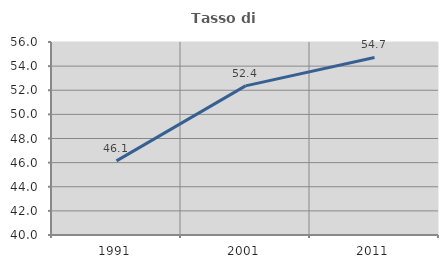
| Category | Tasso di occupazione   |
|---|---|
| 1991.0 | 46.145 |
| 2001.0 | 52.364 |
| 2011.0 | 54.722 |